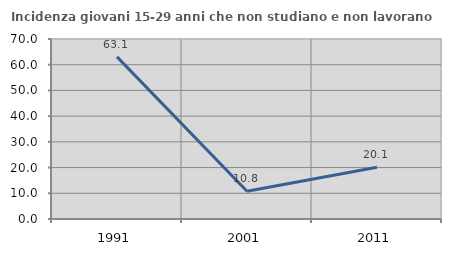
| Category | Incidenza giovani 15-29 anni che non studiano e non lavorano  |
|---|---|
| 1991.0 | 63.051 |
| 2001.0 | 10.762 |
| 2011.0 | 20.126 |